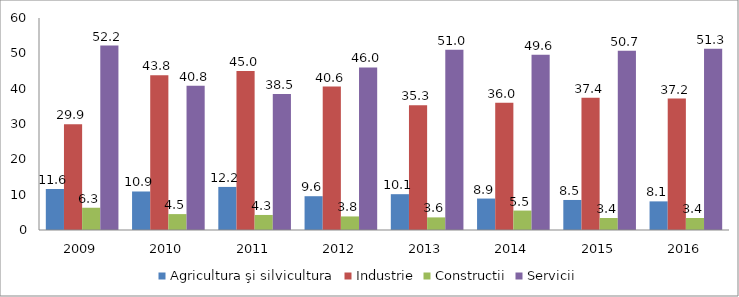
| Category | Agricultura şi silvicultura | Industrie | Constructii | Servicii |
|---|---|---|---|---|
| 2009.0 | 11.6 | 29.9 | 6.3 | 52.2 |
| 2010.0 | 10.9 | 43.8 | 4.5 | 40.8 |
| 2011.0 | 12.19 | 45.031 | 4.255 | 38.524 |
| 2012.0 | 9.563 | 40.583 | 3.839 | 46.015 |
| 2013.0 | 10.137 | 35.288 | 3.569 | 51.006 |
| 2014.0 | 8.9 | 36 | 5.5 | 49.6 |
| 2015.0 | 8.5 | 37.4 | 3.4 | 50.7 |
| 2016.0 | 8.1 | 37.2 | 3.4 | 51.3 |